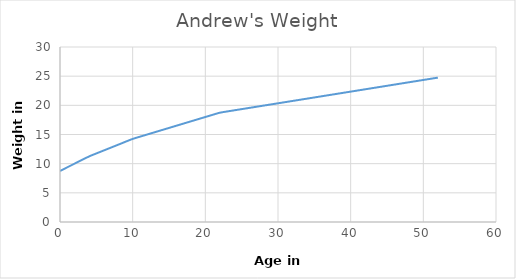
| Category | Series 0 |
|---|---|
| 0.0 | 8.75 |
| 0.52 | 9.075 |
| 1.04 | 9.4 |
| 1.56 | 9.725 |
| 2.08 | 10.05 |
| 2.6 | 10.375 |
| 3.12 | 10.7 |
| 3.64 | 11.025 |
| 4.16 | 11.33 |
| 4.68 | 11.59 |
| 5.199999999999999 | 11.85 |
| 5.719999999999999 | 12.11 |
| 6.239999999999998 | 12.37 |
| 6.759999999999998 | 12.63 |
| 7.279999999999998 | 12.89 |
| 7.799999999999997 | 13.15 |
| 8.319999999999997 | 13.41 |
| 8.839999999999996 | 13.67 |
| 9.359999999999996 | 13.93 |
| 9.879999999999995 | 14.19 |
| 10.399999999999995 | 14.4 |
| 10.919999999999995 | 14.595 |
| 11.439999999999994 | 14.79 |
| 11.959999999999994 | 14.985 |
| 12.479999999999993 | 15.18 |
| 12.999999999999993 | 15.375 |
| 13.519999999999992 | 15.57 |
| 14.039999999999992 | 15.765 |
| 14.559999999999992 | 15.96 |
| 15.079999999999991 | 16.155 |
| 15.59999999999999 | 16.35 |
| 16.11999999999999 | 16.545 |
| 16.63999999999999 | 16.74 |
| 17.15999999999999 | 16.935 |
| 17.67999999999999 | 17.13 |
| 18.19999999999999 | 17.325 |
| 18.719999999999988 | 17.52 |
| 19.239999999999988 | 17.715 |
| 19.759999999999987 | 17.91 |
| 20.279999999999987 | 18.105 |
| 20.799999999999986 | 18.3 |
| 21.319999999999986 | 18.495 |
| 21.839999999999986 | 18.69 |
| 22.359999999999985 | 18.822 |
| 22.879999999999985 | 18.926 |
| 23.399999999999984 | 19.03 |
| 23.919999999999984 | 19.134 |
| 24.439999999999984 | 19.238 |
| 24.959999999999983 | 19.342 |
| 25.479999999999983 | 19.446 |
| 25.999999999999982 | 19.55 |
| 26.519999999999982 | 19.654 |
| 27.03999999999998 | 19.758 |
| 27.55999999999998 | 19.862 |
| 28.07999999999998 | 19.966 |
| 28.59999999999998 | 20.07 |
| 29.11999999999998 | 20.174 |
| 29.63999999999998 | 20.278 |
| 30.15999999999998 | 20.382 |
| 30.67999999999998 | 20.486 |
| 31.199999999999978 | 20.59 |
| 31.719999999999978 | 20.694 |
| 32.23999999999998 | 20.798 |
| 32.759999999999984 | 20.902 |
| 33.27999999999999 | 21.006 |
| 33.79999999999999 | 21.11 |
| 34.31999999999999 | 21.214 |
| 34.839999999999996 | 21.318 |
| 35.36 | 21.422 |
| 35.88 | 21.526 |
| 36.400000000000006 | 21.63 |
| 36.92000000000001 | 21.734 |
| 37.44000000000001 | 21.838 |
| 37.960000000000015 | 21.942 |
| 38.48000000000002 | 22.046 |
| 39.00000000000002 | 22.15 |
| 39.520000000000024 | 22.254 |
| 40.04000000000003 | 22.358 |
| 40.56000000000003 | 22.462 |
| 41.080000000000034 | 22.566 |
| 41.60000000000004 | 22.67 |
| 42.12000000000004 | 22.774 |
| 42.64000000000004 | 22.878 |
| 43.160000000000046 | 22.982 |
| 43.68000000000005 | 23.086 |
| 44.20000000000005 | 23.19 |
| 44.720000000000056 | 23.294 |
| 45.24000000000006 | 23.398 |
| 45.76000000000006 | 23.502 |
| 46.280000000000065 | 23.606 |
| 46.80000000000007 | 23.71 |
| 47.32000000000007 | 23.814 |
| 47.840000000000074 | 23.918 |
| 48.36000000000008 | 24.022 |
| 48.88000000000008 | 24.126 |
| 49.400000000000084 | 24.23 |
| 49.92000000000009 | 24.334 |
| 50.44000000000009 | 24.438 |
| 50.96000000000009 | 24.542 |
| 51.480000000000096 | 24.646 |
| 52.0000000000001 | 24.75 |